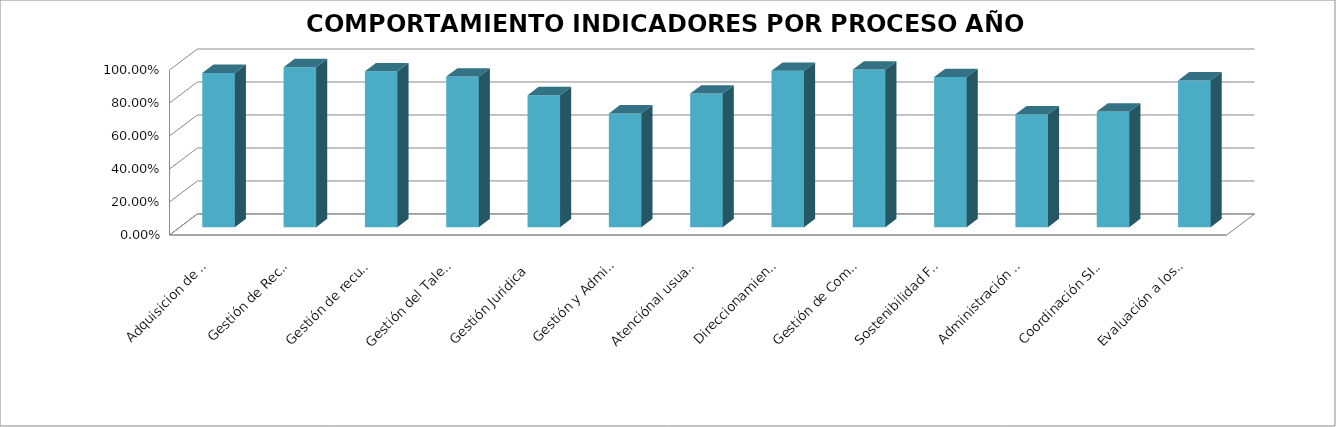
| Category | Series 0 |
|---|---|
| Adquisicion de bienes y servicios  | 0.935 |
| Gestión de Recursos Financieros  | 0.97 |
| Gestión de recursos fisicos  | 0.945 |
| Gestión del Talento Humano | 0.913 |
| Gestión Juridica  | 0.8 |
| Gestión y Administración de la Información  | 0.69 |
| Atenciónal usuario | 0.81 |
| Direccionamiento Estratégico | 0.948 |
| Gestión de Comunicaciones | 0.956 |
| Sostenibilidad Financiera | 0.91 |
| Administración y Manejo del SPNN | 0.684 |
| Coordinación SINAP | 0.701 |
| Evaluación a los Sistemas de Gestión  | 0.89 |